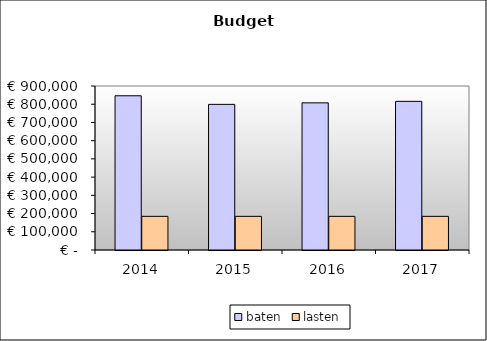
| Category | baten | lasten |
|---|---|---|
| 2014.0 | 846370.833 | 184671.87 |
| 2015.0 | 799212.817 | 184671.87 |
| 2016.0 | 807491.417 | 184671.87 |
| 2017.0 | 815770.017 | 184671.87 |